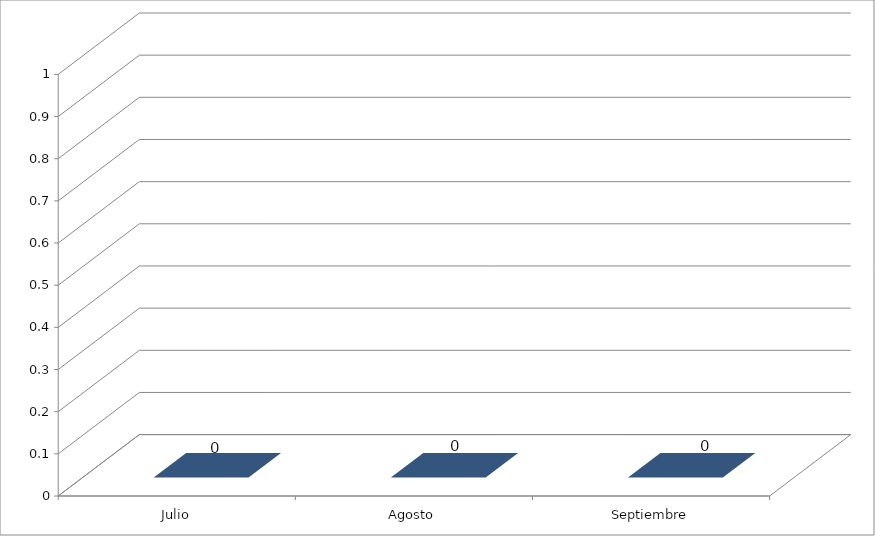
| Category | Series 0 |
|---|---|
| Julio | 0 |
| Agosto | 0 |
| Septiembre | 0 |